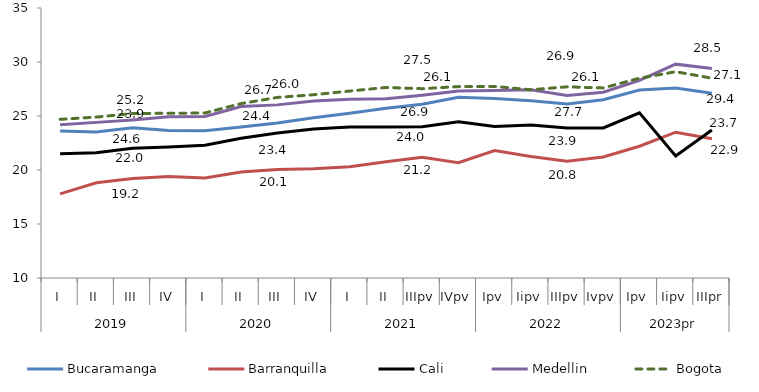
| Category | Bucaramanga | Barranquilla | Cali | Medellin | Bogota |
|---|---|---|---|---|---|
| 0 | 23.61 | 17.79 | 21.51 | 24.19 | 24.69 |
| 1 | 23.53 | 18.82 | 21.6 | 24.41 | 24.9 |
| 2 | 23.91 | 19.22 | 22.01 | 24.64 | 25.23 |
| 3 | 23.65 | 19.4 | 22.13 | 24.92 | 25.25 |
| 4 | 23.63 | 19.26 | 22.3 | 24.95 | 25.28 |
| 5 | 23.98 | 19.82 | 22.94 | 25.88 | 26.15 |
| 6 | 24.36 | 20.05 | 23.43 | 26.03 | 26.72 |
| 7 | 24.83 | 20.11 | 23.79 | 26.38 | 26.97 |
| 8 | 25.26 | 20.3 | 23.97 | 26.55 | 27.31 |
| 9 | 25.71 | 20.77 | 23.98 | 26.59 | 27.64 |
| 10 | 26.08 | 21.19 | 24 | 26.93 | 27.53 |
| 11 | 26.74 | 20.67 | 24.47 | 27.31 | 27.72 |
| 12 | 26.61 | 21.8 | 24.02 | 27.37 | 27.74 |
| 13 | 26.41 | 21.26 | 24.17 | 27.42 | 27.43 |
| 14 | 26.12 | 20.8 | 23.9 | 26.9 | 27.7 |
| 15 | 26.5 | 21.2 | 23.9 | 27.2 | 27.6 |
| 16 | 27.4 | 22.2 | 25.3 | 28.3 | 28.5 |
| 17 | 27.6 | 23.5 | 21.3 | 29.8 | 29.1 |
| 18 | 27.1 | 22.9 | 23.7 | 29.4 | 28.5 |